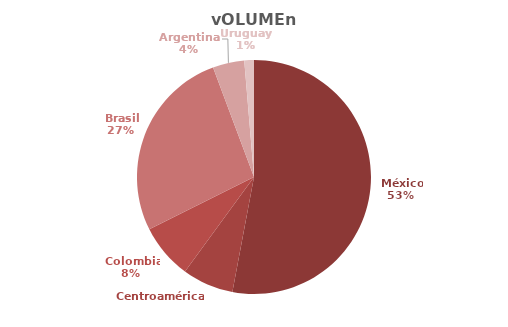
| Category | Series 0 |
|---|---|
| México | 421.62 |
| Centroamérica  | 56.355 |
| Colombia | 60.387 |
| Brasil | 212.424 |
| Argentina  | 34.712 |
| Uruguay  | 10.584 |